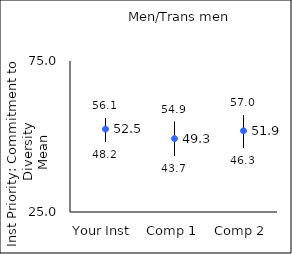
| Category | 25th percentile | 75th percentile | Mean |
|---|---|---|---|
| Your Inst | 48.2 | 56.1 | 52.45 |
| Comp 1 | 43.7 | 54.9 | 49.31 |
| Comp 2 | 46.3 | 57 | 51.89 |